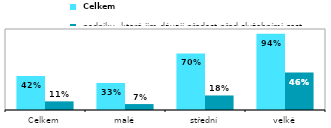
| Category |  Celkem |  podniky, které jim dávají předost před služebními cestami |
|---|---|---|
| Celkem | 0.42 | 0.107 |
| malé | 0.334 | 0.073 |
| střední | 0.699 | 0.18 |
| velké | 0.942 | 0.462 |